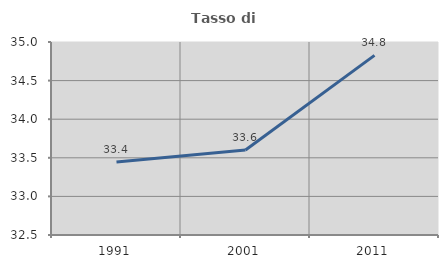
| Category | Tasso di occupazione   |
|---|---|
| 1991.0 | 33.446 |
| 2001.0 | 33.6 |
| 2011.0 | 34.827 |